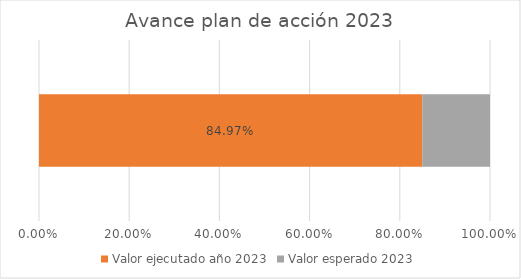
| Category | Valor ejecutado año 2023 | Valor esperado 2023 |
|---|---|---|
| 0 | 0.85 | 0.15 |